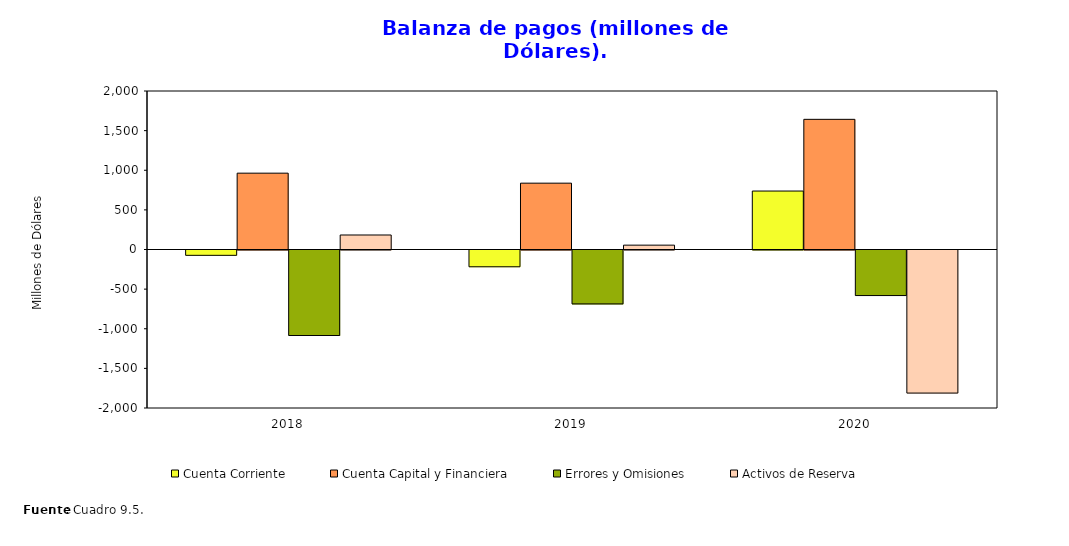
| Category | Cuenta Corriente | Cuenta Capital y Financiera | Errores y Omisiones | Activos de Reserva |
|---|---|---|---|---|
| 2018.0 | -67.247 | 963.246 | -1079.02 | 183.02 |
| 2019.0 | -211.605 | 837.066 | -680.333 | 54.872 |
| 2020.0 | 737.61 | 1642.405 | -574.803 | -1805.212 |